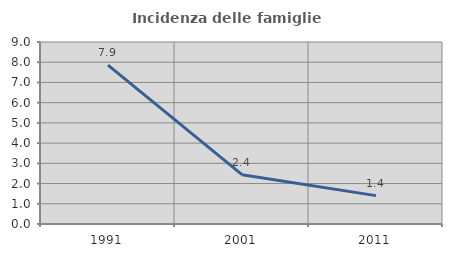
| Category | Incidenza delle famiglie numerose |
|---|---|
| 1991.0 | 7.854 |
| 2001.0 | 2.44 |
| 2011.0 | 1.404 |